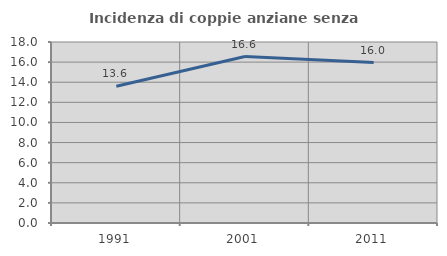
| Category | Incidenza di coppie anziane senza figli  |
|---|---|
| 1991.0 | 13.596 |
| 2001.0 | 16.556 |
| 2011.0 | 15.955 |